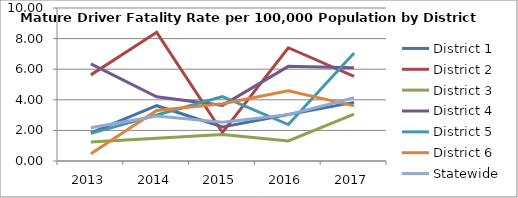
| Category | District 1 | District 2 | District 3 | District 4 | District 5 | District 6 | Statewide |
|---|---|---|---|---|---|---|---|
| 2013.0 | 1.839 | 5.629 | 1.246 | 6.354 | 1.806 | 0.475 | 2.171 |
| 2014.0 | 3.613 | 8.409 | 1.492 | 4.2 | 3.008 | 3.298 | 2.937 |
| 2015.0 | 2.222 | 1.862 | 1.734 | 3.638 | 4.206 | 3.736 | 2.538 |
| 2016.0 | 3.043 | 7.403 | 1.307 | 6.187 | 2.384 | 4.583 | 3.03 |
| 2017.0 | 3.832 | 5.529 | 3.058 | 6.1 | 7.065 | 3.601 | 4.135 |